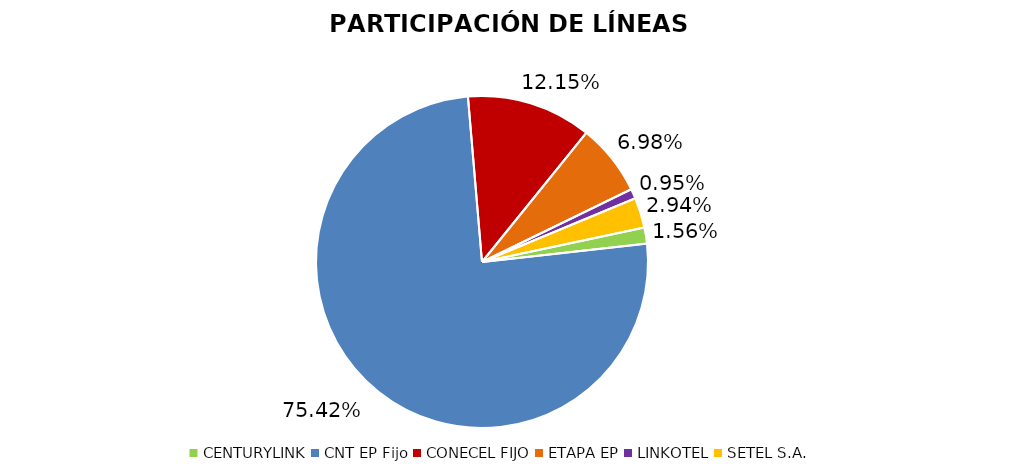
| Category | Participación en el Mercado |
|---|---|
| CENTURYLINK | 0.016 |
| CNT EP Fijo | 0.754 |
| CONECEL FIJO | 0.122 |
| ETAPA EP | 0.07 |
| LINKOTEL | 0.009 |
| SETEL S.A. | 0.029 |